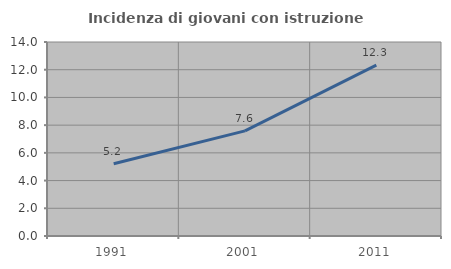
| Category | Incidenza di giovani con istruzione universitaria |
|---|---|
| 1991.0 | 5.213 |
| 2001.0 | 7.589 |
| 2011.0 | 12.338 |